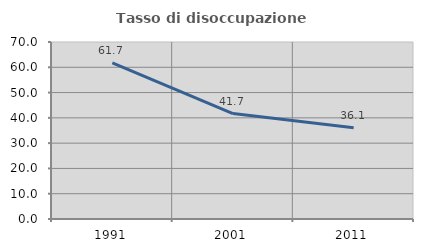
| Category | Tasso di disoccupazione giovanile  |
|---|---|
| 1991.0 | 61.715 |
| 2001.0 | 41.699 |
| 2011.0 | 36.074 |